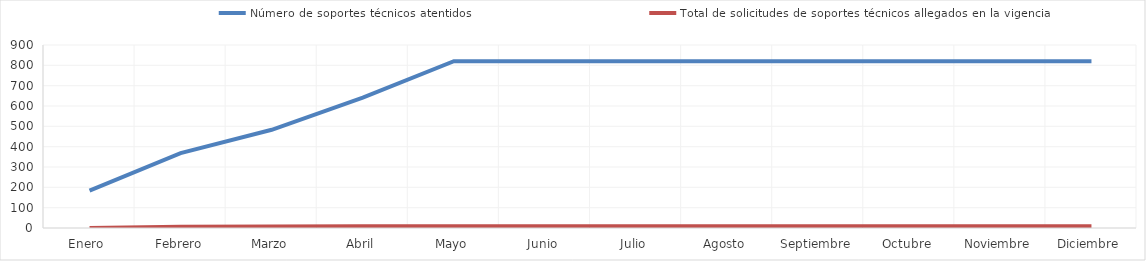
| Category | Número de soportes técnicos atentidos | Total de solicitudes de soportes técnicos allegados en la vigencia |
|---|---|---|
| Enero  | 184 | 0 |
| Febrero | 368 | 6 |
| Marzo | 483 | 7 |
| Abril | 641 | 8 |
| Mayo | 820 | 9 |
| Junio | 820 | 9 |
| Julio | 820 | 9 |
| Agosto | 820 | 9 |
| Septiembre | 820 | 9 |
| Octubre | 820 | 9 |
| Noviembre | 820 | 9 |
| Diciembre | 820 | 9 |